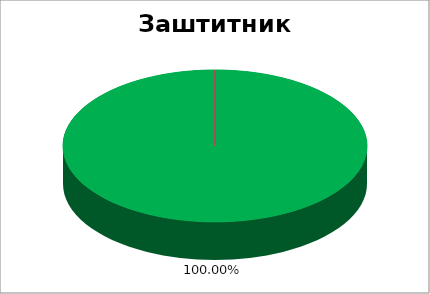
| Category | Заштитник грађана  |
|---|---|
| 0 | 1 |
| 1 | 0 |
| 2 | 0 |
| 3 | 0 |
| 4 | 0 |